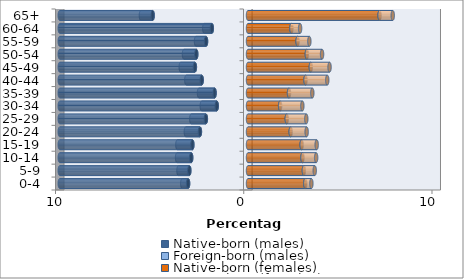
| Category | Native-born (males) | Foreign-born (males) | Native-born (females) | Foreign-born (females) |
|---|---|---|---|---|
| 0-4 | -3.182 | -0.31 | 3.042 | 0.325 |
| 5-9 | -3.118 | -0.576 | 2.967 | 0.579 |
| 10-14 | -3.017 | -0.751 | 2.893 | 0.727 |
| 15-19 | -2.955 | -0.798 | 2.85 | 0.798 |
| 20-24 | -2.554 | -0.748 | 2.267 | 0.848 |
| 25-29 | -2.238 | -0.775 | 2.06 | 1.037 |
| 30-34 | -1.661 | -0.794 | 1.706 | 1.181 |
| 35-39 | -1.775 | -0.828 | 2.179 | 1.238 |
| 40-44 | -2.459 | -0.818 | 3.055 | 1.156 |
| 45-49 | -2.821 | -0.753 | 3.337 | 0.995 |
| 50-54 | -2.748 | -0.654 | 3.126 | 0.809 |
| 55-59 | -2.229 | -0.533 | 2.634 | 0.626 |
| 60-64 | -1.921 | -0.403 | 2.308 | 0.46 |
| 65+ | -5.066 | -0.623 | 6.99 | 0.7 |